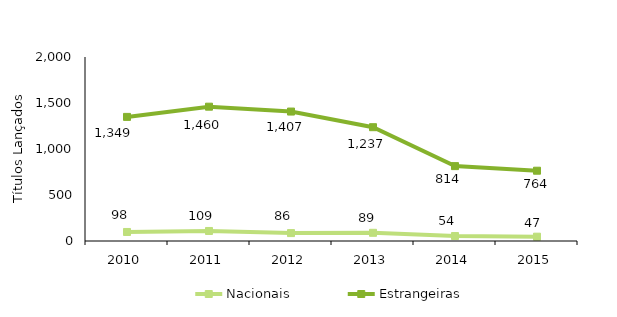
| Category | Nacionais | Estrangeiras |
|---|---|---|
| 2010.0 | 98 | 1349 |
| 2011.0 | 109 | 1460 |
| 2012.0 | 86 | 1407 |
| 2013.0 | 89 | 1237 |
| 2014.0 | 54 | 814 |
| 2015.0 | 47 | 764 |